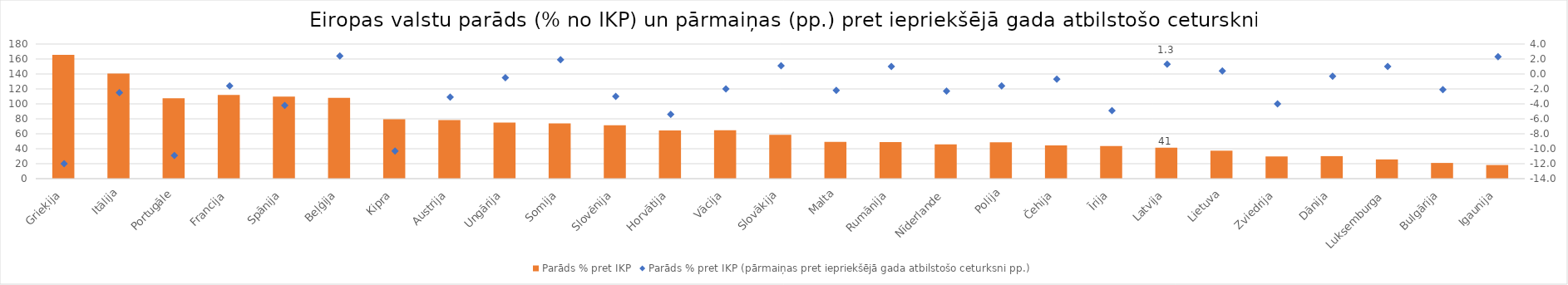
| Category | Parāds % pret IKP |
|---|---|
| Grieķija | 165.5 |
| Itālija | 140.6 |
| Portugāle | 107.5 |
| Francija | 111.9 |
| Spānija | 109.8 |
|  Beļģija | 108 |
| Kipra | 79.4 |
| Austrija | 78.2 |
| Ungārija | 75 |
| Somija | 73.8 |
| Slovēnija | 71.4 |
| Horvātija | 64.4 |
| Vācija | 64.8 |
| Slovākija | 58.6 |
| Malta | 49.3 |
| Rumānija | 48.9 |
| Nīderlande | 45.9 |
| Polija | 48.7 |
| Čehija | 44.5 |
| Īrija | 43.6 |
| Latvija | 41.4 |
| Lietuva | 37.4 |
| Zviedrija | 29.7 |
| Dānija | 30.1 |
| Luksemburga | 25.7 |
| Bulgārija | 21 |
| Igaunija | 18.2 |